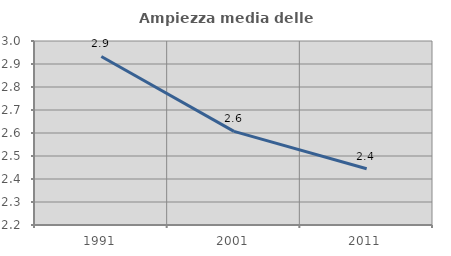
| Category | Ampiezza media delle famiglie |
|---|---|
| 1991.0 | 2.933 |
| 2001.0 | 2.607 |
| 2011.0 | 2.444 |